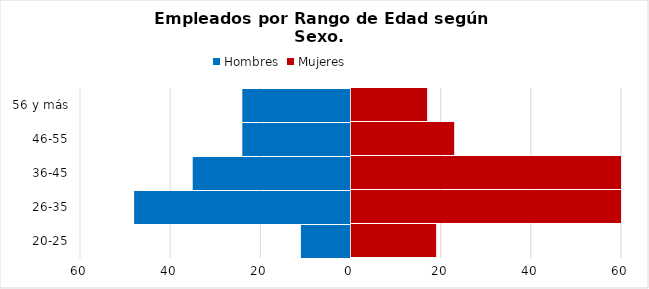
| Category | Hombres | Mujeres |
|---|---|---|
| 20-25 | -11 | 19 |
| 26-35 | -48 | 87 |
| 36-45 | -35 | 68 |
| 46-55 | -24 | 23 |
| 56 y más | -24 | 17 |